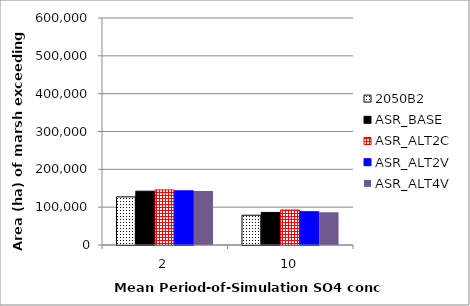
| Category | 2050B2 | ASR_BASE | ASR_ALT2C | ASR_ALT2V | ASR_ALT4V |
|---|---|---|---|---|---|
| 2.0 | 127225 | 142250 | 145700 | 143200 | 142525 |
| 10.0 | 78650 | 86075 | 92425 | 87975 | 86500 |